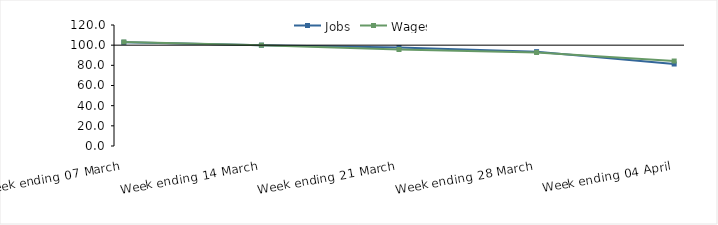
| Category | Jobs | Wages |
|---|---|---|
| 0 | 102.828 | 103.182 |
| 1900-01-01 | 100 | 100 |
| 1900-01-02 | 97.563 | 95.7 |
| 1900-01-03 | 93.577 | 92.743 |
| 1900-01-04 | 81.315 | 84.279 |